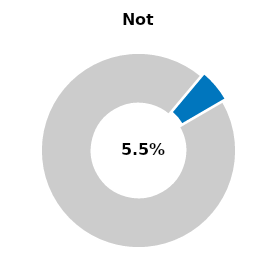
| Category | Series 0 |
|---|---|
| Not passed | 0.055 |
| Other | 0.945 |